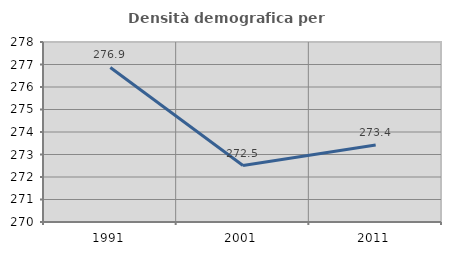
| Category | Densità demografica |
|---|---|
| 1991.0 | 276.87 |
| 2001.0 | 272.511 |
| 2011.0 | 273.417 |